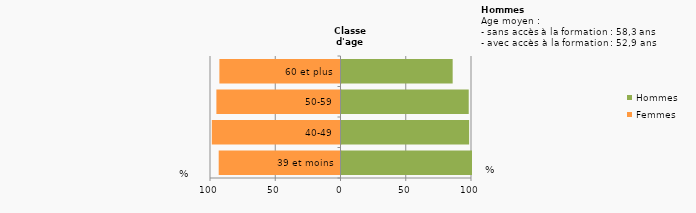
| Category | Femmes | Hommes |
|---|---|---|
| 39 et moins | -93.333 | 100 |
| 40-49 | -98.598 | 97.79 |
| 50-59 | -95.1 | 97.492 |
| 60 et plus | -92.8 | 85.185 |